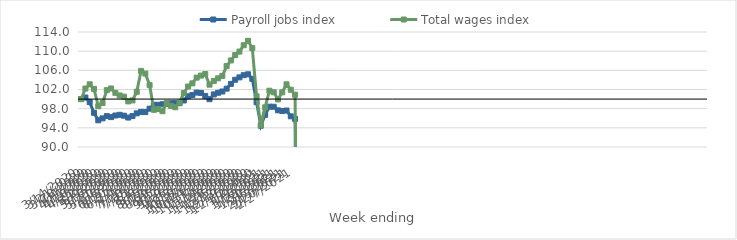
| Category | Payroll jobs index | Total wages index |
|---|---|---|
| 14/03/2020 | 100 | 100 |
| 21/03/2020 | 100.328 | 102.201 |
| 28/03/2020 | 99.356 | 103.086 |
| 04/04/2020 | 97.137 | 102.127 |
| 11/04/2020 | 95.572 | 98.504 |
| 18/04/2020 | 95.97 | 99.179 |
| 25/04/2020 | 96.448 | 101.862 |
| 02/05/2020 | 96.241 | 102.219 |
| 09/05/2020 | 96.574 | 101.308 |
| 16/05/2020 | 96.72 | 100.762 |
| 23/05/2020 | 96.532 | 100.504 |
| 30/05/2020 | 96.145 | 99.52 |
| 06/06/2020 | 96.458 | 99.721 |
| 13/06/2020 | 97.025 | 101.532 |
| 20/06/2020 | 97.33 | 105.88 |
| 27/06/2020 | 97.285 | 105.322 |
| 04/07/2020 | 98 | 102.915 |
| 11/07/2020 | 98.806 | 97.763 |
| 18/07/2020 | 98.802 | 97.923 |
| 25/07/2020 | 98.923 | 97.475 |
| 01/08/2020 | 99.023 | 99.203 |
| 08/08/2020 | 99.146 | 98.585 |
| 15/08/2020 | 99.166 | 98.299 |
| 22/08/2020 | 99.146 | 99.267 |
| 29/08/2020 | 99.71 | 101.28 |
| 05/09/2020 | 100.583 | 102.626 |
| 12/09/2020 | 100.859 | 103.282 |
| 19/09/2020 | 101.362 | 104.479 |
| 26/09/2020 | 101.284 | 104.899 |
| 03/10/2020 | 100.651 | 105.232 |
| 10/10/2020 | 99.978 | 103.011 |
| 17/10/2020 | 100.971 | 103.793 |
| 24/10/2020 | 101.317 | 104.336 |
| 31/10/2020 | 101.584 | 104.835 |
| 07/11/2020 | 102.178 | 106.884 |
| 14/11/2020 | 103.166 | 108.064 |
| 21/11/2020 | 104.034 | 109.186 |
| 28/11/2020 | 104.532 | 109.913 |
| 05/12/2020 | 104.988 | 111.236 |
| 12/12/2020 | 105.175 | 112.16 |
| 19/12/2020 | 104.238 | 110.624 |
| 26/12/2020 | 99.349 | 100.57 |
| 02/01/2021 | 94.45 | 94.557 |
| 09/01/2021 | 96.712 | 98.275 |
| 16/01/2021 | 98.414 | 101.743 |
| 23/01/2021 | 98.398 | 101.422 |
| 30/01/2021 | 97.657 | 99.929 |
| 06/02/2021 | 97.517 | 101.412 |
| 13/02/2021 | 97.613 | 103.082 |
| 20/02/2021 | 96.404 | 101.952 |
| 27/02/2021 | 95.864 | 100.909 |